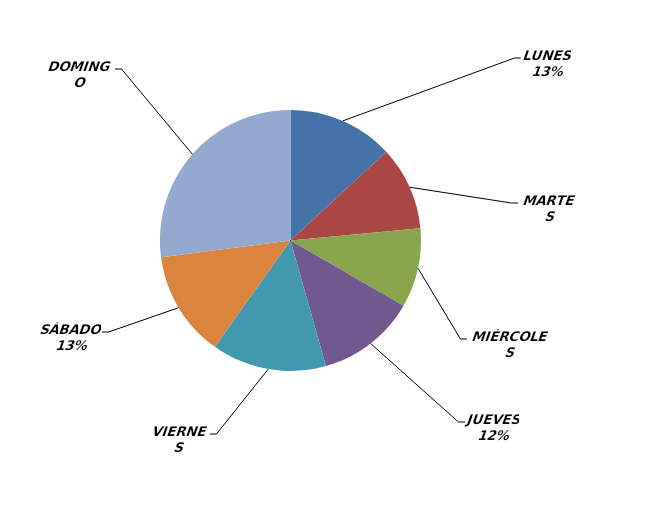
| Category | Series 0 |
|---|---|
| LUNES | 48 |
| MARTES | 38 |
| MIÉRCOLES | 36 |
| JUEVES | 45 |
| VIERNES | 52 |
| SÁBADO | 48 |
| DOMINGO | 99 |